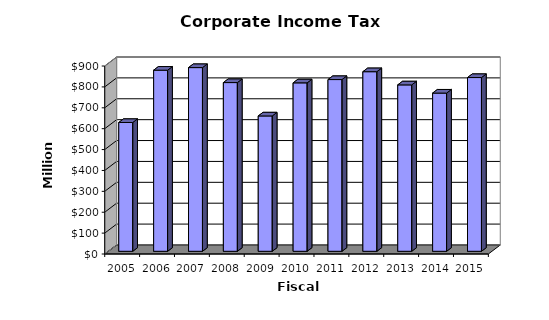
| Category | Amount |
|---|---|
| 2005.0 | 616690263 |
| 2006.0 | 867115786 |
| 2007.0 | 879575371 |
| 2008.0 | 807851584 |
| 2009.0 | 648032537 |
| 2010.0 | 806472760 |
| 2011.0 | 822258802.84 |
| 2012.0 | 859922839.55 |
| 2013.0 | 796728154.4 |
| 2014.0 | 757490742.09 |
| 2015.0 | 831906887.16 |